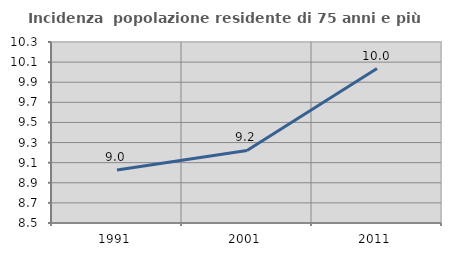
| Category | Incidenza  popolazione residente di 75 anni e più |
|---|---|
| 1991.0 | 9.027 |
| 2001.0 | 9.221 |
| 2011.0 | 10.036 |